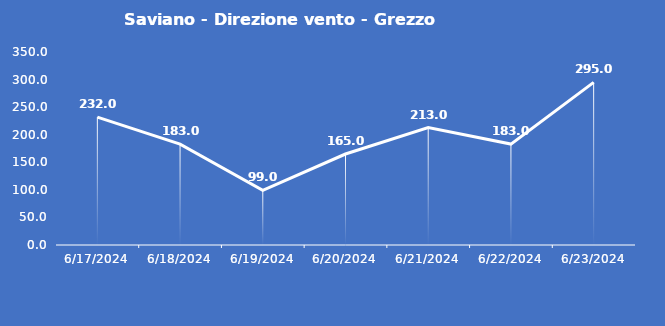
| Category | Saviano - Direzione vento - Grezzo (°N) |
|---|---|
| 6/17/24 | 232 |
| 6/18/24 | 183 |
| 6/19/24 | 99 |
| 6/20/24 | 165 |
| 6/21/24 | 213 |
| 6/22/24 | 183 |
| 6/23/24 | 295 |